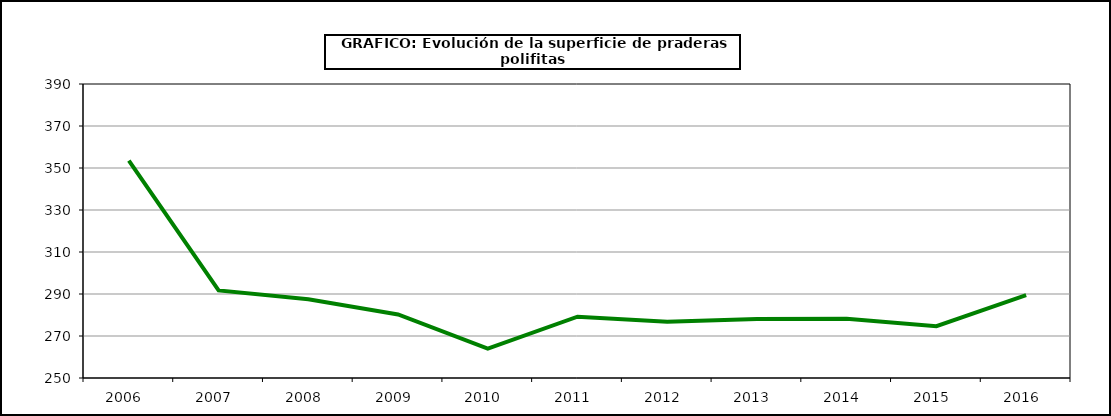
| Category | Superficie |
|---|---|
| 2006.0 | 353.544 |
| 2007.0 | 291.688 |
| 2008.0 | 287.487 |
| 2009.0 | 280.266 |
| 2010.0 | 264.037 |
| 2011.0 | 279.178 |
| 2012.0 | 276.784 |
| 2013.0 | 278.082 |
| 2014.0 | 278.257 |
| 2015.0 | 274.641 |
| 2016.0 | 289.468 |